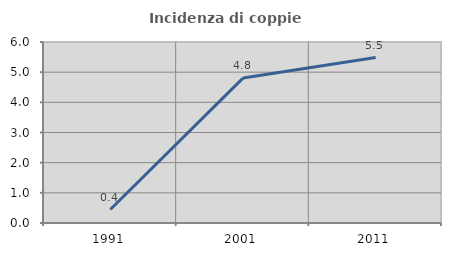
| Category | Incidenza di coppie miste |
|---|---|
| 1991.0 | 0.446 |
| 2001.0 | 4.803 |
| 2011.0 | 5.485 |